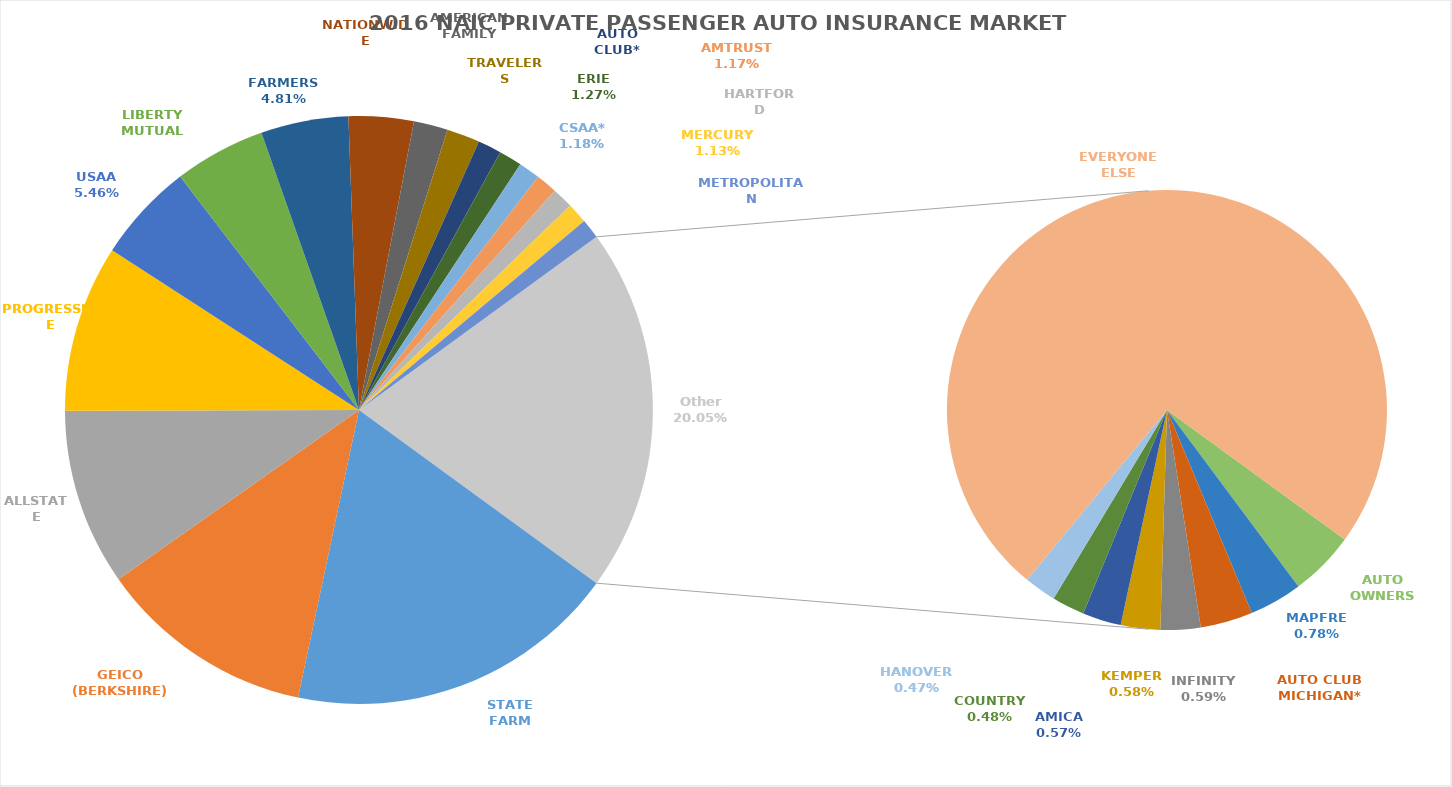
| Category | Series 0 |
|---|---|
| STATE FARM | 18.3 |
| GEICO (BERKSHIRE) | 11.92 |
| ALLSTATE | 9.72 |
| PROGRESSIVE | 9.17 |
| USAA | 5.46 |
| LIBERTY MUTUAL | 5.02 |
| FARMERS | 4.81 |
| NATIONWIDE | 3.57 |
| AMERICAN FAMILY | 1.87 |
| TRAVELERS | 1.82 |
| AUTO CLUB* | 1.29 |
| ERIE | 1.27 |
| CSAA* | 1.18 |
| AMTRUST | 1.17 |
| HARTFORD | 1.16 |
| MERCURY | 1.13 |
| METROPOLITAN | 1.09 |
| AUTO OWNERS | 0.96 |
| MAPFRE | 0.78 |
| AUTO CLUB MICHIGAN* | 0.77 |
| INFINITY | 0.59 |
| KEMPER | 0.58 |
| AMICA | 0.57 |
| COUNTRY | 0.48 |
| HANOVER | 0.47 |
| EVERYONE ELSE | 14.85 |